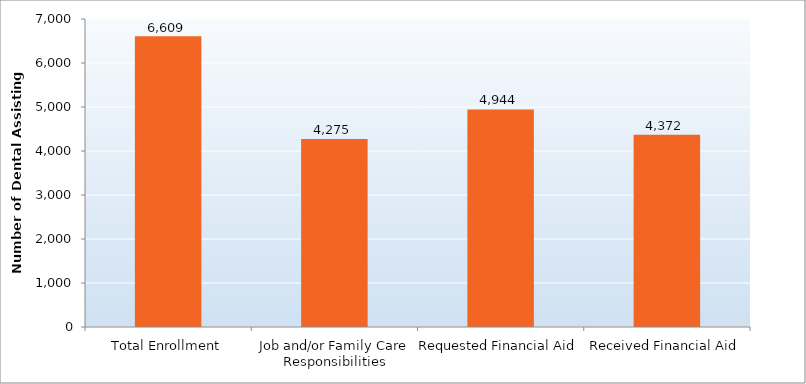
| Category | Series 0 |
|---|---|
| Total Enrollment | 6609 |
| Job and/or Family Care Responsibilities | 4275 |
| Requested Financial Aid | 4944 |
| Received Financial Aid | 4372 |